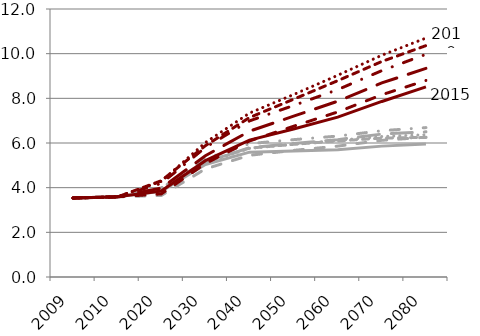
| Category | TR2010 | TR2011 | TR2012 | TR2013 | TR2014 | TR2015 | Alt2010 | Alt2011 | Alt2012 | Alt2013 | Alt2014 | Alt2015 |
|---|---|---|---|---|---|---|---|---|---|---|---|---|
| 2009.0 | 3.53 | 3.54 | 3.54 | 3.54 | 3.54 | 3.54 | 3.53 | 3.54 | 3.54 | 3.54 | 3.54 | 3.54 |
| 2010.0 | 3.59 | 3.58 | 3.59 | 3.59 | 3.59 | 3.59 | 3.59 | 3.58 | 3.59 | 3.59 | 3.59 | 3.59 |
| 2020.0 | 3.91 | 3.99 | 3.96 | 3.88 | 3.65 | 3.84 | 4.28 | 4.31 | 4.19 | 3.98 | 3.72 | 3.85 |
| 2030.0 | 5.11 | 5.16 | 5.29 | 5.14 | 4.84 | 5.04 | 6.02 | 5.88 | 5.8 | 5.43 | 5.08 | 5.21 |
| 2040.0 | 5.76 | 5.77 | 5.97 | 5.79 | 5.45 | 5.59 | 7.34 | 7.14 | 6.99 | 6.53 | 6.09 | 6.13 |
| 2050.0 | 5.94 | 5.94 | 6.15 | 5.98 | 5.67 | 5.64 | 8.17 | 7.96 | 7.68 | 7.2 | 6.75 | 6.63 |
| 2060.0 | 6.12 | 6.09 | 6.31 | 6.15 | 5.86 | 5.7 | 9.03 | 8.79 | 8.39 | 7.87 | 7.39 | 7.16 |
| 2070.0 | 6.29 | 6.22 | 6.55 | 6.4 | 6.12 | 5.86 | 9.93 | 9.65 | 9.24 | 8.69 | 8.16 | 7.86 |
| 2080.0 | 6.37 | 6.25 | 6.69 | 6.5 | 6.26 | 5.96 | 10.7 | 10.36 | 9.97 | 9.34 | 8.8 | 8.51 |